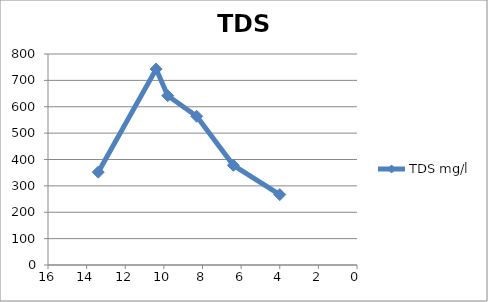
| Category | TDS mg/l |
|---|---|
| 13.4 | 352 |
| 10.4 | 743 |
| 9.8 | 642 |
| 8.3 | 564 |
| 6.4 | 378 |
| 4.0 | 267 |